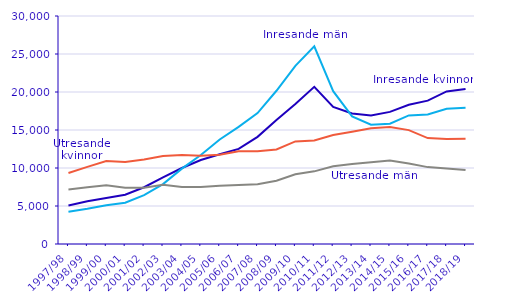
| Category | Inresande kvinnor | Inresande män | Utresande kvinnor | Utresande män |
|---|---|---|---|---|
| 1997/98 | 5054 | 4231 | 9348 | 7166 |
| 1998/99 | 5614 | 4631 | 10145 | 7471 |
| 1999/00 | 6045 | 5089 | 10911 | 7729 |
| 2000/01 | 6486 | 5431 | 10800 | 7412 |
| 2001/02 | 7468 | 6439 | 11128 | 7417 |
| 2002/03 | 8769 | 7884 | 11585 | 7792 |
| 2003/04 | 9996 | 9919 | 11720 | 7491 |
| 2004/05 | 11057 | 11715 | 11615 | 7506 |
| 2005/06 | 11811 | 13747 | 11747 | 7660 |
| 2006/07 | 12513 | 15404 | 12189 | 7770 |
| 2007/08 | 14097 | 17223 | 12220 | 7873 |
| 2008/09 | 16325 | 20164 | 12430 | 8334 |
| 2009/10 | 18433 | 23443 | 13496 | 9178 |
| 2010/11 | 20681 | 26012 | 13621 | 9560 |
| 2011/12 | 18032 | 20115 | 14340 | 10237 |
| 2012/13 | 17172 | 16792 | 14783 | 10525 |
| 2013/14 | 16920 | 15692 | 15239 | 10742 |
| 2014/15 | 17384 | 15837 | 15382 | 10983 |
| 2015/16 | 18327 | 16917 | 14982 | 10595 |
| 2016/17 | 18859 | 17043 | 13934 | 10117 |
| 2017/18 | 20071 | 17787 | 13824 | 9947 |
| 2018/19 | 20407 | 17927 | 13861 | 9723 |